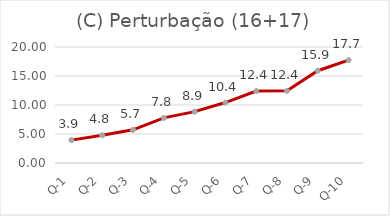
| Category | DESORD2016 |
|---|---|
| Q-1 | 3.943 |
| Q-2 | 4.789 |
| Q-3 | 5.721 |
| Q-4 | 7.778 |
| Q-5 | 8.855 |
| Q-6 | 10.425 |
| Q-7 | 12.404 |
| Q-8 | 12.438 |
| Q-9 | 15.911 |
| Q-10 | 17.736 |